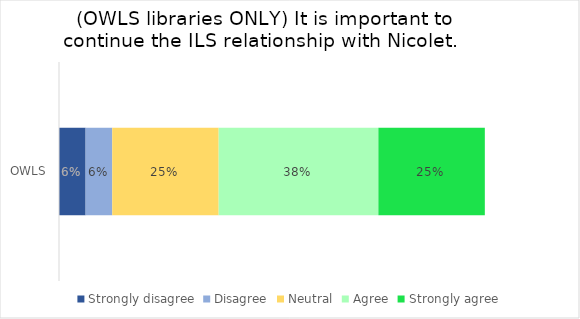
| Category | Strongly disagree | Disagree | Neutral | Agree | Strongly agree |
|---|---|---|---|---|---|
| OWLS | 0.062 | 0.062 | 0.25 | 0.375 | 0.25 |